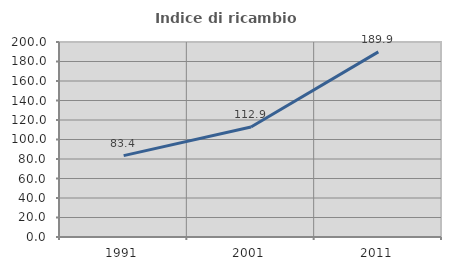
| Category | Indice di ricambio occupazionale  |
|---|---|
| 1991.0 | 83.439 |
| 2001.0 | 112.857 |
| 2011.0 | 189.888 |